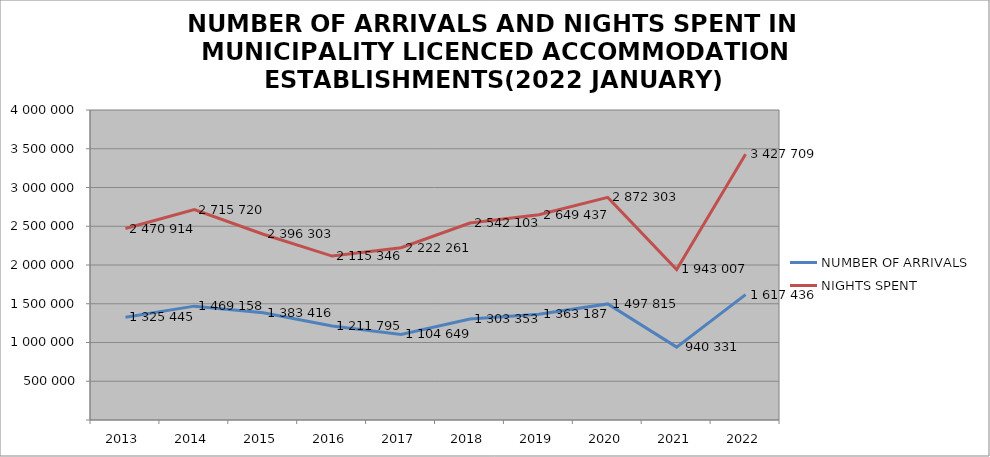
| Category | NUMBER OF ARRIVALS | NIGHTS SPENT |
|---|---|---|
| 2013 | 1325445 | 2470914 |
| 2014 | 1469158 | 2715720 |
| 2015 | 1383416 | 2396303 |
| 2016 | 1211795 | 2115346 |
| 2017 | 1104649 | 2222261 |
| 2018 | 1303353 | 2542103 |
| 2019 | 1363187 | 2649437 |
| 2020 | 1497815 | 2872303 |
| 2021 | 940331 | 1943007 |
| 2022 | 1617436 | 3427709 |